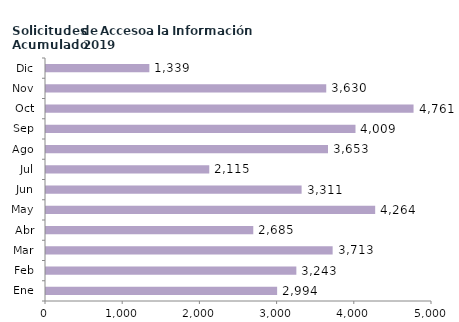
| Category | Series 0 |
|---|---|
| Ene | 2994 |
| Feb | 3243 |
| Mar | 3713 |
| Abr | 2685 |
| May | 4264 |
| Jun | 3311 |
| Jul | 2115 |
| Ago | 3653 |
| Sep | 4009 |
| Oct | 4761 |
| Nov | 3630 |
| Dic | 1339 |